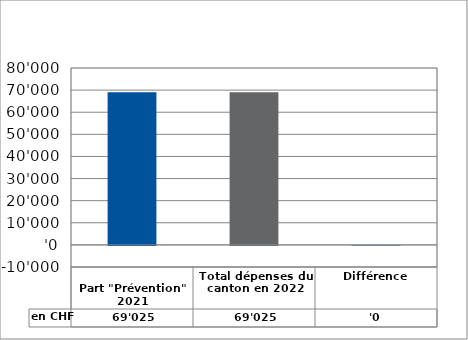
| Category | en CHF |
|---|---|
| 
Part "Prévention" 2021

 | 69025 |
| Total dépenses du canton en 2022 | 69025.1 |
| Différence | -0.1 |